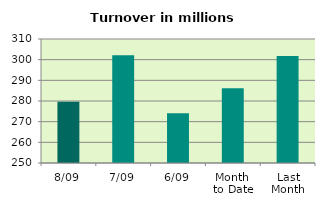
| Category | Series 0 |
|---|---|
| 8/09 | 279.629 |
| 7/09 | 302.09 |
| 6/09 | 274.012 |
| Month 
to Date | 286.168 |
| Last
Month | 301.741 |